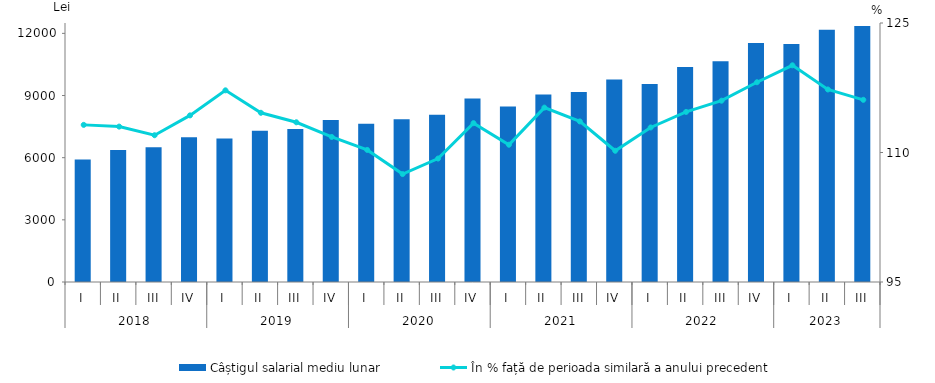
| Category | Câștigul salarial mediu lunar |
|---|---|
| 0 | 5906.5 |
| 1 | 6369.8 |
| 2 | 6507.3 |
| 3 | 6987.5 |
| 4 | 6923 |
| 5 | 7302.6 |
| 6 | 7385 |
| 7 | 7813.1 |
| 8 | 7633.9 |
| 9 | 7849 |
| 10 | 8074.3 |
| 11 | 8859.9 |
| 12 | 8468.6 |
| 13 | 9044.5 |
| 14 | 9175.7 |
| 15 | 9767.6 |
| 16 | 9560.8 |
| 17 | 10376.2 |
| 18 | 10648.1 |
| 19 | 11539.1 |
| 20 | 11486.2 |
| 21 | 12175.9 |
| 22 | 12357.2 |